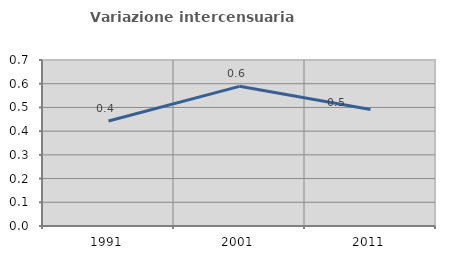
| Category | Variazione intercensuaria annua |
|---|---|
| 1991.0 | 0.443 |
| 2001.0 | 0.589 |
| 2011.0 | 0.491 |